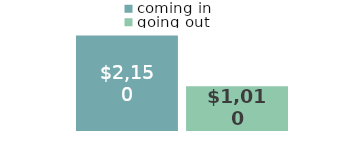
| Category | coming in | going out |
|---|---|---|
| Money coming in: | 2150 | 1010 |